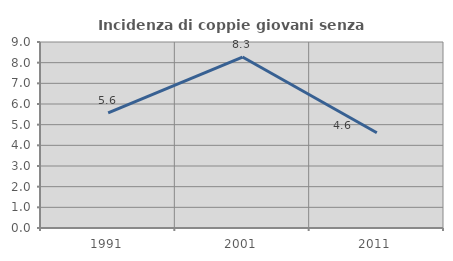
| Category | Incidenza di coppie giovani senza figli |
|---|---|
| 1991.0 | 5.573 |
| 2001.0 | 8.273 |
| 2011.0 | 4.612 |